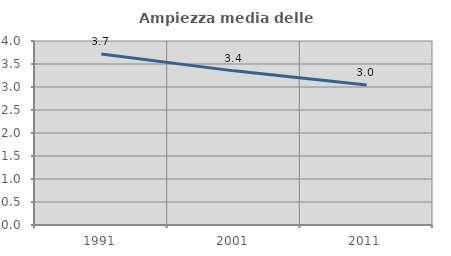
| Category | Ampiezza media delle famiglie |
|---|---|
| 1991.0 | 3.719 |
| 2001.0 | 3.351 |
| 2011.0 | 3.044 |